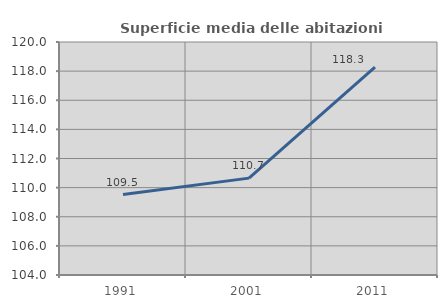
| Category | Superficie media delle abitazioni occupate |
|---|---|
| 1991.0 | 109.527 |
| 2001.0 | 110.653 |
| 2011.0 | 118.279 |